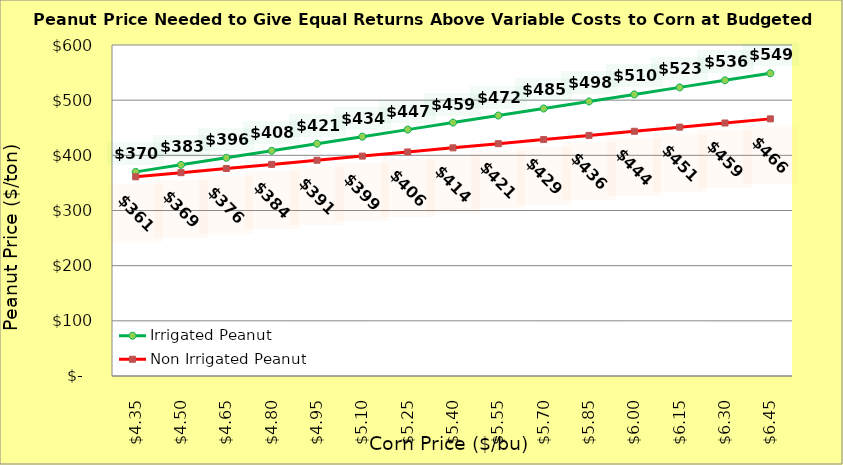
| Category | Irrigated Peanut | Non Irrigated Peanut |
|---|---|---|
| 4.349999999999998 | 370.026 | 361.094 |
| 4.499999999999998 | 382.791 | 368.594 |
| 4.649999999999999 | 395.557 | 376.094 |
| 4.799999999999999 | 408.323 | 383.594 |
| 4.949999999999999 | 421.089 | 391.094 |
| 5.1 | 433.855 | 398.594 |
| 5.25 | 446.621 | 406.094 |
| 5.4 | 459.387 | 413.594 |
| 5.550000000000001 | 472.153 | 421.094 |
| 5.700000000000001 | 484.919 | 428.594 |
| 5.850000000000001 | 497.685 | 436.094 |
| 6.000000000000002 | 510.451 | 443.594 |
| 6.150000000000002 | 523.217 | 451.094 |
| 6.3000000000000025 | 535.983 | 458.594 |
| 6.450000000000003 | 548.749 | 466.094 |